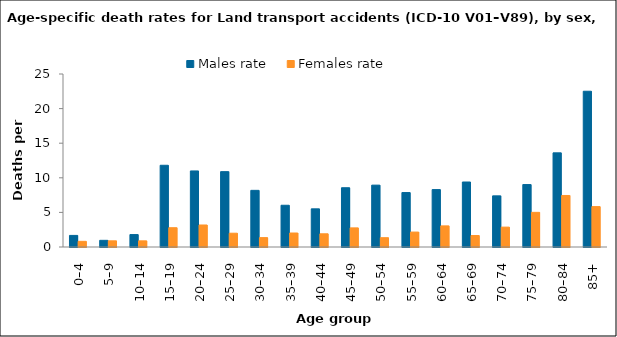
| Category | Males rate | Females rate |
|---|---|---|
| 0–4 | 1.675 | 0.818 |
| 5–9 | 0.962 | 0.892 |
| 10–14 | 1.795 | 0.888 |
| 15–19 | 11.811 | 2.787 |
| 20–24 | 10.99 | 3.18 |
| 25–29 | 10.888 | 1.992 |
| 30–34 | 8.187 | 1.355 |
| 35–39 | 6.033 | 2.023 |
| 40–44 | 5.515 | 1.908 |
| 45–49 | 8.565 | 2.762 |
| 50–54 | 8.94 | 1.346 |
| 55–59 | 7.868 | 2.157 |
| 60–64 | 8.296 | 3.051 |
| 65–69 | 9.392 | 1.66 |
| 70–74 | 7.391 | 2.871 |
| 75–79 | 9.024 | 5.008 |
| 80–84 | 13.602 | 7.446 |
| 85+ | 22.508 | 5.838 |